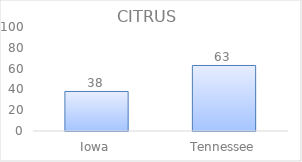
| Category | Series 0 |
|---|---|
| Iowa | 38 |
| Tennessee | 63 |